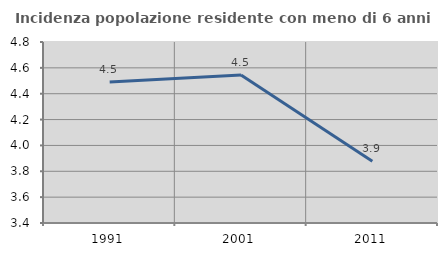
| Category | Incidenza popolazione residente con meno di 6 anni |
|---|---|
| 1991.0 | 4.49 |
| 2001.0 | 4.545 |
| 2011.0 | 3.878 |